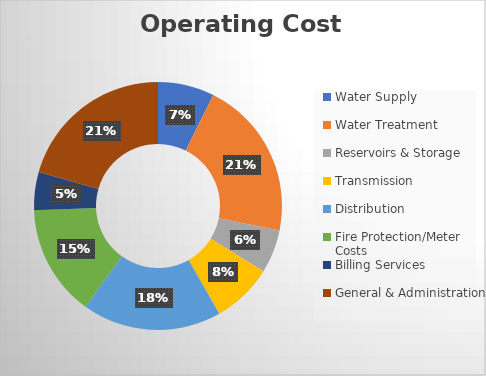
| Category | Series 0 |
|---|---|
| Water Supply | 336802.966 |
| Water Treatment | 952872.193 |
| Reservoirs & Storage | 259157.415 |
| Transmission | 363857.063 |
| Distribution | 830880.334 |
| Fire Protection/Meter Costs | 666151.741 |
| Billing Services | 226489.953 |
| General & Administration | 942642.267 |